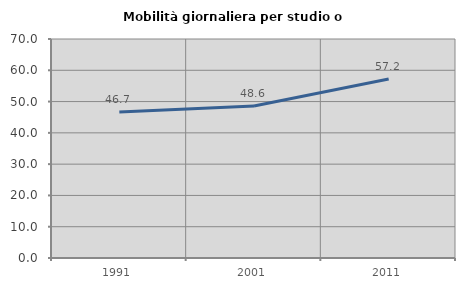
| Category | Mobilità giornaliera per studio o lavoro |
|---|---|
| 1991.0 | 46.667 |
| 2001.0 | 48.603 |
| 2011.0 | 57.225 |